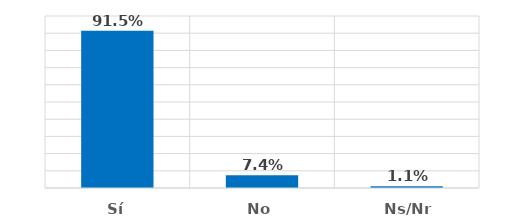
| Category | Series 0 |
|---|---|
| Sí | 0.915 |
| No | 0.074 |
| Ns/Nr | 0.011 |